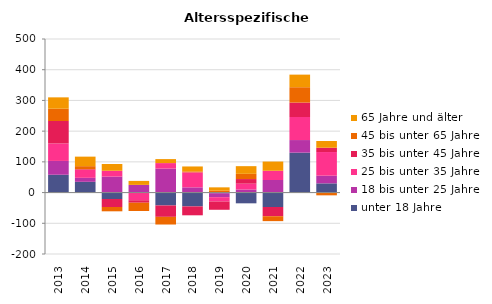
| Category | unter 18 Jahre | 18 bis unter 25 Jahre | 25 bis unter 35 Jahre | 35 bis unter 45 Jahre | 45 bis unter 65 Jahre | 65 Jahre und älter |
|---|---|---|---|---|---|---|
| 2013.0 | 58 | 45 | 57 | 73 | 40 | 37 |
| 2014.0 | 35 | 13 | 26 | 2 | 10 | 31 |
| 2015.0 | -21 | 52 | 19 | -26 | -14 | 22 |
| 2016.0 | 0 | 25 | -25 | -8 | -27 | 13 |
| 2017.0 | -42 | 78 | 18 | -37 | -25 | 13 |
| 2018.0 | -45 | 17 | 49 | -29 | 3 | 16 |
| 2019.0 | -2 | -13 | -14 | -27 | 6 | 11 |
| 2020.0 | -35 | 10 | 19 | 15 | 17 | 25 |
| 2021.0 | -47 | 41 | 30 | -30 | -16 | 30 |
| 2022.0 | 130 | 41 | 75 | 47 | 50 | 41 |
| 2023.0 | 30 | 25 | 77 | 14 | -9 | 22 |